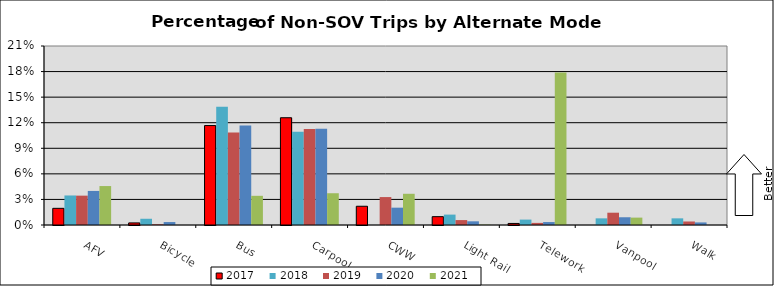
| Category | 2017 | 2018 | 2019 | 2020 | 2021 |
|---|---|---|---|---|---|
| AFV | 0.02 | 0.035 | 0.034 | 0.04 | 0.046 |
| Bicycle | 0.002 | 0.007 | 0.001 | 0.003 | 0 |
| Bus | 0.117 | 0.139 | 0.108 | 0.117 | 0.034 |
| Carpool | 0.126 | 0.109 | 0.113 | 0.113 | 0.037 |
| CWW | 0.022 | 0 | 0.033 | 0.02 | 0.037 |
| Light Rail | 0.01 | 0.012 | 0.006 | 0.004 | 0 |
| Telework | 0.002 | 0.006 | 0.002 | 0.003 | 0.179 |
| Vanpool | 0 | 0.008 | 0.014 | 0.009 | 0.009 |
| Walk | 0 | 0.008 | 0.004 | 0.003 | 0 |